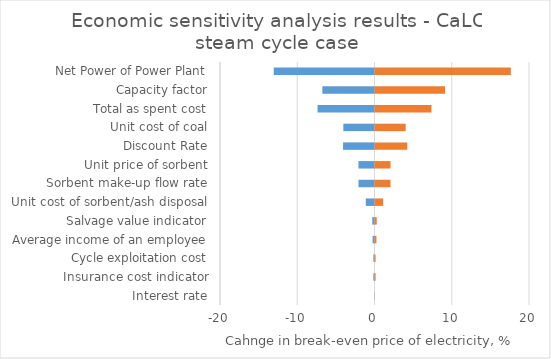
| Category | Series 0 | Series 1 |
|---|---|---|
| Interest rate | -0.024 | 0.023 |
| Insurance cost indicator | -0.146 | 0.146 |
| Cycle exploitation cost | -0.143 | 0.143 |
| Average income of an employee | -0.249 | 0.249 |
| Salvage value indicator | -0.289 | 0.289 |
| Unit cost of sorbent/ash disposal | -1.127 | 1.127 |
| Sorbent make-up flow rate | -2.074 | 2.074 |
| Unit price of sorbent | -2.074 | 2.074 |
| Discount Rate | -4.072 | 4.248 |
| Unit cost of coal | -4.035 | 4.035 |
| Total as spent cost | -7.372 | 7.372 |
| Capacity factor | -6.752 | 9.135 |
| Net Power of Power Plant | -13.043 | 17.647 |